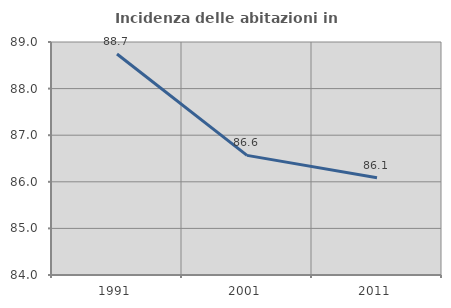
| Category | Incidenza delle abitazioni in proprietà  |
|---|---|
| 1991.0 | 88.742 |
| 2001.0 | 86.567 |
| 2011.0 | 86.087 |